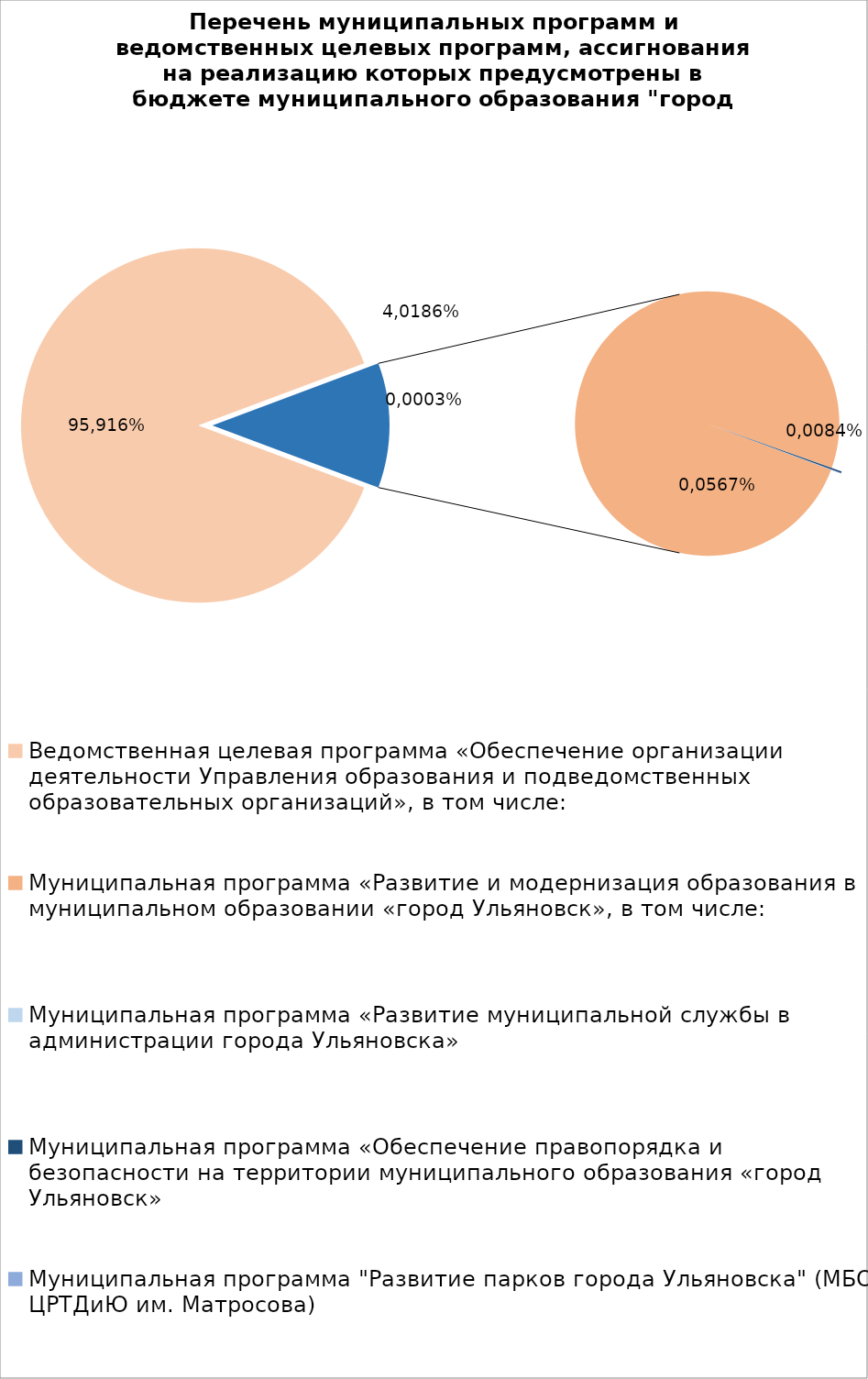
| Category | Series 0 |
|---|---|
| Ведомственная целевая программа «Обеспечение организации деятельности Управления образования и подведомственных образовательных организаций», в том числе: | 7946741.41 |
| Муниципальная программа «Развитие и модернизация образования в муниципальном образовании «город Ульяновск», в том числе: | 1018975.86 |
| Муниципальная программа «Развитие муниципальной службы в администрации города Ульяновска» | 14.3 |
| Муниципальная программа «Обеспечение правопорядка и безопасности на территории муниципального образования «город Ульяновск» | 2083.73 |
| Муниципальная программа "Развитие парков города Ульяновска" (МБОУ ЦРТДиЮ им. Матросова) | 600 |